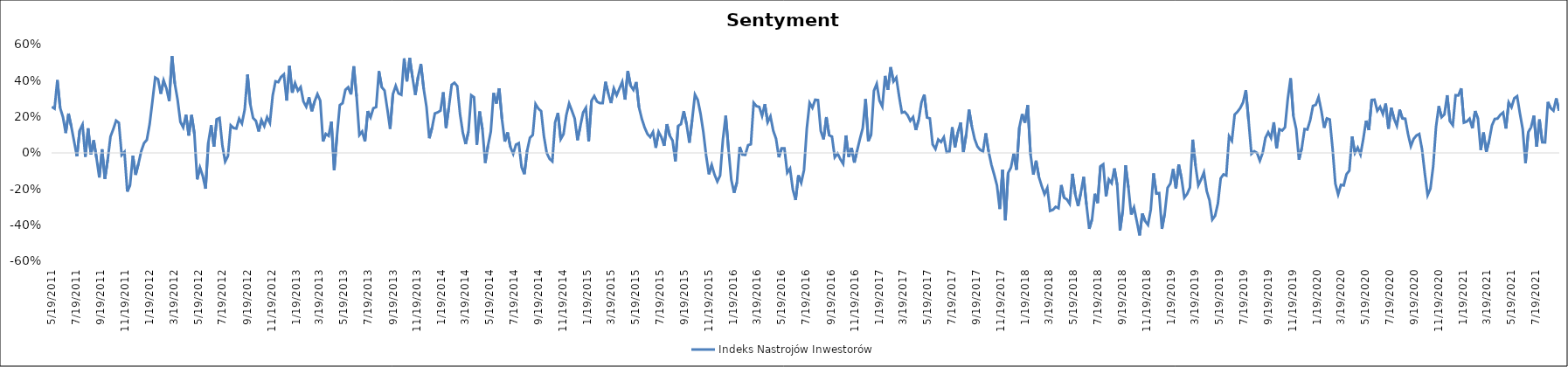
| Category | Indeks Nastrojów Inwestorów |
|---|---|
| 5/19/11 | 0.255 |
| 5/26/11 | 0.245 |
| 6/2/11 | 0.403 |
| 6/9/11 | 0.25 |
| 6/16/11 | 0.199 |
| 6/23/11 | 0.11 |
| 6/30/11 | 0.218 |
| 7/7/11 | 0.145 |
| 7/14/11 | 0.063 |
| 7/21/11 | -0.019 |
| 7/28/11 | 0.125 |
| 8/4/11 | 0.157 |
| 8/11/11 | -0.022 |
| 8/18/11 | 0.136 |
| 8/25/11 | -0.008 |
| 9/1/11 | 0.07 |
| 9/8/11 | -0.028 |
| 9/15/11 | -0.136 |
| 9/22/11 | 0.02 |
| 9/29/11 | -0.144 |
| 10/6/11 | -0.038 |
| 10/13/11 | 0.09 |
| 10/20/11 | 0.132 |
| 10/27/11 | 0.179 |
| 11/3/11 | 0.167 |
| 11/10/11 | -0.012 |
| 11/17/11 | 0.005 |
| 11/24/11 | -0.214 |
| 12/1/11 | -0.177 |
| 12/8/11 | -0.016 |
| 12/15/11 | -0.121 |
| 12/22/11 | -0.06 |
| 12/29/11 | 0.01 |
| 1/5/12 | 0.054 |
| 1/12/12 | 0.073 |
| 1/19/12 | 0.159 |
| 1/26/12 | 0.287 |
| 2/2/12 | 0.417 |
| 2/9/12 | 0.408 |
| 2/16/12 | 0.327 |
| 2/23/12 | 0.402 |
| 3/1/12 | 0.357 |
| 3/8/12 | 0.287 |
| 3/15/12 | 0.536 |
| 3/22/12 | 0.384 |
| 3/29/12 | 0.294 |
| 4/5/12 | 0.172 |
| 4/12/12 | 0.141 |
| 4/19/12 | 0.212 |
| 4/26/12 | 0.096 |
| 5/3/12 | 0.21 |
| 5/10/12 | 0.107 |
| 5/17/12 | -0.146 |
| 5/24/12 | -0.081 |
| 5/31/12 | -0.128 |
| 6/7/12 | -0.198 |
| 6/14/12 | 0.058 |
| 6/21/12 | 0.154 |
| 6/28/12 | 0.034 |
| 7/5/12 | 0.187 |
| 7/12/12 | 0.193 |
| 7/19/12 | 0.042 |
| 7/26/12 | -0.048 |
| 8/2/12 | -0.017 |
| 8/9/12 | 0.153 |
| 8/16/12 | 0.138 |
| 8/23/12 | 0.135 |
| 8/30/12 | 0.189 |
| 9/6/12 | 0.163 |
| 9/13/12 | 0.241 |
| 9/20/12 | 0.434 |
| 9/27/12 | 0.27 |
| 10/4/12 | 0.193 |
| 10/11/12 | 0.177 |
| 10/18/12 | 0.119 |
| 10/25/12 | 0.182 |
| 11/1/12 | 0.148 |
| 11/8/12 | 0.198 |
| 11/15/12 | 0.166 |
| 11/22/12 | 0.317 |
| 11/29/12 | 0.396 |
| 12/6/12 | 0.392 |
| 12/13/12 | 0.421 |
| 12/20/12 | 0.435 |
| 12/27/12 | 0.29 |
| 1/3/13 | 0.482 |
| 1/10/13 | 0.333 |
| 1/17/13 | 0.386 |
| 1/24/13 | 0.344 |
| 1/31/13 | 0.365 |
| 2/7/13 | 0.285 |
| 2/14/13 | 0.256 |
| 2/21/13 | 0.308 |
| 2/28/13 | 0.231 |
| 3/7/13 | 0.285 |
| 3/14/13 | 0.326 |
| 3/21/13 | 0.29 |
| 3/28/13 | 0.063 |
| 4/4/13 | 0.105 |
| 4/11/13 | 0.094 |
| 4/18/13 | 0.174 |
| 4/25/13 | -0.096 |
| 5/2/13 | 0.097 |
| 5/9/13 | 0.264 |
| 5/16/13 | 0.276 |
| 5/23/13 | 0.349 |
| 5/30/13 | 0.364 |
| 6/6/13 | 0.324 |
| 6/13/13 | 0.48 |
| 6/20/13 | 0.313 |
| 6/27/13 | 0.099 |
| 7/4/13 | 0.118 |
| 7/11/13 | 0.063 |
| 7/18/13 | 0.231 |
| 7/25/13 | 0.197 |
| 8/1/13 | 0.247 |
| 8/8/13 | 0.254 |
| 8/15/13 | 0.453 |
| 8/22/13 | 0.364 |
| 8/29/13 | 0.346 |
| 9/5/13 | 0.243 |
| 9/12/13 | 0.133 |
| 9/19/13 | 0.326 |
| 9/26/13 | 0.371 |
| 10/3/13 | 0.329 |
| 10/10/13 | 0.322 |
| 10/17/13 | 0.523 |
| 10/24/13 | 0.396 |
| 10/31/13 | 0.526 |
| 11/7/13 | 0.418 |
| 11/14/13 | 0.321 |
| 11/21/13 | 0.422 |
| 11/28/13 | 0.493 |
| 12/5/13 | 0.355 |
| 12/12/13 | 0.255 |
| 12/19/13 | 0.081 |
| 12/26/13 | 0.14 |
| 1/2/14 | 0.219 |
| 1/9/14 | 0.224 |
| 1/16/14 | 0.234 |
| 1/23/14 | 0.336 |
| 1/30/14 | 0.138 |
| 2/6/14 | 0.253 |
| 2/13/14 | 0.377 |
| 2/20/14 | 0.388 |
| 2/27/14 | 0.37 |
| 3/6/14 | 0.215 |
| 3/13/14 | 0.112 |
| 3/20/14 | 0.049 |
| 3/27/14 | 0.118 |
| 4/3/14 | 0.32 |
| 4/10/14 | 0.309 |
| 4/17/14 | 0.045 |
| 4/24/14 | 0.229 |
| 5/1/14 | 0.131 |
| 5/8/14 | -0.055 |
| 5/15/14 | 0.04 |
| 5/22/14 | 0.118 |
| 5/29/14 | 0.332 |
| 6/5/14 | 0.273 |
| 6/12/14 | 0.358 |
| 6/19/14 | 0.186 |
| 6/26/14 | 0.063 |
| 7/3/14 | 0.114 |
| 7/10/14 | 0.033 |
| 7/17/14 | -0.005 |
| 7/24/14 | 0.046 |
| 7/31/14 | 0.054 |
| 8/7/14 | -0.079 |
| 8/14/14 | -0.118 |
| 8/21/14 | 0.013 |
| 8/28/14 | 0.085 |
| 9/4/14 | 0.1 |
| 9/11/14 | 0.271 |
| 9/18/14 | 0.245 |
| 9/25/14 | 0.231 |
| 10/2/14 | 0.092 |
| 10/9/14 | 0 |
| 10/16/14 | -0.033 |
| 10/23/14 | -0.047 |
| 10/30/14 | 0.169 |
| 11/6/14 | 0.221 |
| 11/13/14 | 0.076 |
| 11/20/14 | 0.104 |
| 11/27/14 | 0.209 |
| 12/4/14 | 0.274 |
| 12/11/14 | 0.233 |
| 12/18/14 | 0.19 |
| 12/25/14 | 0.07 |
| 1/1/15 | 0.147 |
| 1/8/15 | 0.224 |
| 1/15/15 | 0.25 |
| 1/22/15 | 0.063 |
| 1/29/15 | 0.289 |
| 2/5/15 | 0.315 |
| 2/12/15 | 0.284 |
| 2/19/15 | 0.276 |
| 2/26/15 | 0.276 |
| 3/5/15 | 0.394 |
| 3/12/15 | 0.329 |
| 3/19/15 | 0.276 |
| 3/26/15 | 0.357 |
| 4/2/15 | 0.319 |
| 4/9/15 | 0.357 |
| 4/16/15 | 0.394 |
| 4/23/15 | 0.295 |
| 4/30/15 | 0.454 |
| 5/7/15 | 0.372 |
| 5/14/15 | 0.349 |
| 5/21/15 | 0.393 |
| 5/28/15 | 0.252 |
| 6/4/15 | 0.188 |
| 6/11/15 | 0.141 |
| 6/18/15 | 0.105 |
| 6/25/15 | 0.088 |
| 7/2/15 | 0.116 |
| 7/9/15 | 0.028 |
| 7/16/15 | 0.117 |
| 7/23/15 | 0.087 |
| 7/30/15 | 0.039 |
| 8/6/15 | 0.159 |
| 8/13/15 | 0.095 |
| 8/20/15 | 0.068 |
| 8/27/15 | -0.047 |
| 9/3/15 | 0.15 |
| 9/10/15 | 0.16 |
| 9/17/15 | 0.231 |
| 9/24/15 | 0.159 |
| 10/1/15 | 0.057 |
| 10/8/15 | 0.183 |
| 10/15/15 | 0.323 |
| 10/22/15 | 0.294 |
| 10/29/15 | 0.217 |
| 11/5/15 | 0.116 |
| 11/12/15 | -0.015 |
| 11/19/15 | -0.118 |
| 11/26/15 | -0.066 |
| 12/3/15 | -0.12 |
| 12/10/15 | -0.159 |
| 12/17/15 | -0.125 |
| 12/24/15 | 0.074 |
| 12/31/15 | 0.207 |
| 1/7/16 | 0.02 |
| 1/14/16 | -0.149 |
| 1/21/16 | -0.221 |
| 1/28/16 | -0.164 |
| 2/4/16 | 0.033 |
| 2/11/16 | -0.01 |
| 2/18/16 | -0.011 |
| 2/25/16 | 0.043 |
| 3/3/16 | 0.048 |
| 3/10/16 | 0.278 |
| 3/17/16 | 0.259 |
| 3/24/16 | 0.255 |
| 3/31/16 | 0.205 |
| 4/7/16 | 0.27 |
| 4/14/16 | 0.17 |
| 4/21/16 | 0.203 |
| 4/28/16 | 0.124 |
| 5/5/16 | 0.078 |
| 5/12/16 | -0.024 |
| 5/19/16 | 0.025 |
| 5/26/16 | 0.025 |
| 6/2/16 | -0.109 |
| 6/9/16 | -0.087 |
| 6/16/16 | -0.202 |
| 6/23/16 | -0.261 |
| 6/30/16 | -0.124 |
| 7/7/16 | -0.165 |
| 7/14/16 | -0.094 |
| 7/21/16 | 0.135 |
| 7/28/16 | 0.277 |
| 8/4/16 | 0.25 |
| 8/11/16 | 0.294 |
| 8/18/16 | 0.292 |
| 8/25/16 | 0.122 |
| 9/1/16 | 0.075 |
| 9/8/16 | 0.198 |
| 9/15/16 | 0.098 |
| 9/22/16 | 0.09 |
| 9/29/16 | -0.024 |
| 10/6/16 | -0.004 |
| 10/13/16 | -0.035 |
| 10/20/16 | -0.06 |
| 10/27/16 | 0.097 |
| 11/3/16 | -0.023 |
| 11/10/16 | 0.028 |
| 11/17/16 | -0.054 |
| 11/24/16 | 0.013 |
| 12/1/16 | 0.078 |
| 12/8/16 | 0.137 |
| 12/15/16 | 0.298 |
| 12/22/16 | 0.065 |
| 12/29/16 | 0.102 |
| 1/5/17 | 0.344 |
| 1/12/17 | 0.382 |
| 1/19/17 | 0.289 |
| 1/26/17 | 0.257 |
| 2/2/17 | 0.426 |
| 2/9/17 | 0.35 |
| 2/16/17 | 0.475 |
| 2/23/17 | 0.396 |
| 3/2/17 | 0.417 |
| 3/9/17 | 0.315 |
| 3/16/17 | 0.223 |
| 3/23/17 | 0.228 |
| 3/30/17 | 0.21 |
| 4/6/17 | 0.178 |
| 4/13/17 | 0.199 |
| 4/20/17 | 0.127 |
| 4/27/17 | 0.182 |
| 5/4/17 | 0.28 |
| 5/11/17 | 0.323 |
| 5/18/17 | 0.196 |
| 5/25/17 | 0.191 |
| 6/1/17 | 0.047 |
| 6/8/17 | 0.022 |
| 6/15/17 | 0.074 |
| 6/22/17 | 0.06 |
| 6/29/17 | 0.087 |
| 7/6/17 | 0.004 |
| 7/13/17 | 0.007 |
| 7/20/17 | 0.142 |
| 7/27/17 | 0.031 |
| 8/3/17 | 0.114 |
| 8/10/17 | 0.168 |
| 8/17/17 | 0.005 |
| 8/24/17 | 0.102 |
| 8/31/17 | 0.24 |
| 9/7/17 | 0.148 |
| 9/14/17 | 0.078 |
| 9/21/17 | 0.036 |
| 9/28/17 | 0.017 |
| 10/5/17 | 0.008 |
| 10/12/17 | 0.108 |
| 10/19/17 | 0.009 |
| 10/26/17 | -0.065 |
| 11/2/17 | -0.12 |
| 11/9/17 | -0.18 |
| 11/16/17 | -0.311 |
| 11/23/17 | -0.093 |
| 11/30/17 | -0.373 |
| 12/7/17 | -0.11 |
| 12/14/17 | -0.081 |
| 12/21/17 | -0.004 |
| 12/28/17 | -0.093 |
| 1/4/18 | 0.141 |
| 1/11/18 | 0.215 |
| 1/18/18 | 0.167 |
| 1/25/18 | 0.264 |
| 2/1/18 | -0.009 |
| 2/8/18 | -0.12 |
| 2/15/18 | -0.043 |
| 2/22/18 | -0.133 |
| 3/1/18 | -0.184 |
| 3/8/18 | -0.228 |
| 3/15/18 | -0.194 |
| 3/22/18 | -0.321 |
| 3/29/18 | -0.315 |
| 4/5/18 | -0.299 |
| 4/12/18 | -0.306 |
| 4/19/18 | -0.178 |
| 4/26/18 | -0.248 |
| 5/3/18 | -0.258 |
| 5/10/18 | -0.282 |
| 5/17/18 | -0.116 |
| 5/24/18 | -0.23 |
| 5/31/18 | -0.295 |
| 6/7/18 | -0.22 |
| 6/14/18 | -0.133 |
| 6/21/18 | -0.286 |
| 6/28/18 | -0.421 |
| 7/5/18 | -0.368 |
| 7/12/18 | -0.226 |
| 7/19/18 | -0.278 |
| 7/26/18 | -0.075 |
| 8/2/18 | -0.063 |
| 8/9/18 | -0.24 |
| 8/16/18 | -0.147 |
| 8/23/18 | -0.167 |
| 8/30/18 | -0.086 |
| 9/6/18 | -0.178 |
| 9/13/18 | -0.43 |
| 9/20/18 | -0.317 |
| 9/27/18 | -0.068 |
| 10/4/18 | -0.192 |
| 10/11/18 | -0.341 |
| 10/18/18 | -0.302 |
| 10/25/18 | -0.379 |
| 11/1/18 | -0.457 |
| 11/8/18 | -0.336 |
| 11/15/18 | -0.378 |
| 11/22/18 | -0.398 |
| 11/29/18 | -0.313 |
| 12/6/18 | -0.113 |
| 12/13/18 | -0.225 |
| 12/20/18 | -0.223 |
| 12/27/18 | -0.421 |
| 1/3/19 | -0.335 |
| 1/10/19 | -0.194 |
| 1/17/19 | -0.17 |
| 1/24/19 | -0.089 |
| 1/31/19 | -0.197 |
| 2/7/19 | -0.064 |
| 2/14/19 | -0.142 |
| 2/21/19 | -0.248 |
| 2/28/19 | -0.228 |
| 3/7/19 | -0.191 |
| 3/14/19 | 0.073 |
| 3/21/19 | -0.069 |
| 3/28/19 | -0.18 |
| 4/4/19 | -0.147 |
| 4/11/19 | -0.108 |
| 4/18/19 | -0.211 |
| 4/25/19 | -0.263 |
| 5/2/19 | -0.369 |
| 5/9/19 | -0.348 |
| 5/16/19 | -0.28 |
| 5/23/19 | -0.141 |
| 5/30/19 | -0.119 |
| 6/6/19 | -0.125 |
| 6/13/19 | 0.092 |
| 6/20/19 | 0.067 |
| 6/27/19 | 0.212 |
| 7/4/19 | 0.228 |
| 7/11/19 | 0.249 |
| 7/18/19 | 0.279 |
| 7/25/19 | 0.348 |
| 8/1/19 | 0.175 |
| 8/8/19 | -0.005 |
| 8/15/19 | 0.009 |
| 8/22/19 | 0 |
| 8/29/19 | -0.043 |
| 9/5/19 | 0 |
| 9/12/19 | 0.083 |
| 9/19/19 | 0.114 |
| 9/26/19 | 0.083 |
| 10/3/19 | 0.169 |
| 10/10/19 | 0.026 |
| 10/17/19 | 0.131 |
| 10/24/19 | 0.124 |
| 10/31/19 | 0.142 |
| 11/7/19 | 0.301 |
| 11/14/19 | 0.414 |
| 11/21/19 | 0.205 |
| 11/28/19 | 0.132 |
| 12/5/19 | -0.037 |
| 12/12/19 | 0.027 |
| 12/19/19 | 0.132 |
| 12/26/19 | 0.129 |
| 1/2/20 | 0.181 |
| 1/9/20 | 0.26 |
| 1/16/20 | 0.266 |
| 1/23/20 | 0.309 |
| 1/30/20 | 0.234 |
| 2/6/20 | 0.139 |
| 2/13/20 | 0.191 |
| 2/20/20 | 0.185 |
| 2/27/20 | 0.026 |
| 3/5/20 | -0.17 |
| 3/12/20 | -0.23 |
| 3/19/20 | -0.177 |
| 3/26/20 | -0.18 |
| 4/2/20 | -0.118 |
| 4/9/20 | -0.098 |
| 4/16/20 | 0.091 |
| 4/23/20 | 0 |
| 4/30/20 | 0.029 |
| 5/7/20 | -0.009 |
| 5/14/20 | 0.078 |
| 5/21/20 | 0.179 |
| 5/28/20 | 0.127 |
| 6/4/20 | 0.293 |
| 6/11/20 | 0.295 |
| 6/18/20 | 0.233 |
| 6/25/20 | 0.255 |
| 7/2/20 | 0.216 |
| 7/9/20 | 0.273 |
| 7/16/20 | 0.134 |
| 7/23/20 | 0.25 |
| 7/30/20 | 0.189 |
| 8/6/20 | 0.15 |
| 8/13/20 | 0.24 |
| 8/20/20 | 0.19 |
| 8/27/20 | 0.189 |
| 9/3/20 | 0.104 |
| 9/10/20 | 0.037 |
| 9/17/20 | 0.077 |
| 9/24/20 | 0.097 |
| 10/1/20 | 0.105 |
| 10/8/20 | 0.02 |
| 10/15/20 | -0.114 |
| 10/22/20 | -0.234 |
| 10/29/20 | -0.198 |
| 11/5/20 | -0.072 |
| 11/12/20 | 0.144 |
| 11/19/20 | 0.259 |
| 11/26/20 | 0.198 |
| 12/3/20 | 0.213 |
| 12/10/20 | 0.319 |
| 12/17/20 | 0.175 |
| 12/24/20 | 0.153 |
| 12/31/20 | 0.32 |
| 1/7/21 | 0.318 |
| 1/14/21 | 0.358 |
| 1/21/21 | 0.168 |
| 1/28/21 | 0.174 |
| 2/4/21 | 0.189 |
| 2/11/21 | 0.136 |
| 2/18/21 | 0.232 |
| 2/25/21 | 0.19 |
| 3/4/21 | 0.017 |
| 3/11/21 | 0.113 |
| 3/18/21 | 0.006 |
| 3/25/21 | 0.067 |
| 4/1/21 | 0.152 |
| 4/8/21 | 0.188 |
| 4/15/21 | 0.19 |
| 4/22/21 | 0.211 |
| 4/29/21 | 0.224 |
| 5/6/21 | 0.135 |
| 5/13/21 | 0.28 |
| 5/20/21 | 0.253 |
| 5/27/21 | 0.303 |
| 6/3/21 | 0.314 |
| 6/10/21 | 0.219 |
| 6/17/21 | 0.132 |
| 6/24/21 | -0.056 |
| 7/1/21 | 0.115 |
| 7/8/21 | 0.143 |
| 7/15/21 | 0.206 |
| 7/22/21 | 0.035 |
| 7/29/21 | 0.185 |
| 8/5/21 | 0.059 |
| 8/12/21 | 0.058 |
| 8/19/21 | 0.282 |
| 8/26/21 | 0.248 |
| 9/2/21 | 0.234 |
| 9/9/21 | 0.302 |
| 9/16/21 | 0.234 |